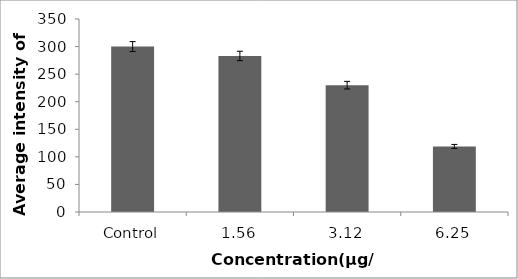
| Category | Series 0 |
|---|---|
| Control | 300 |
| 1.56 | 283 |
| 3.12 | 230 |
| 6.25 | 119 |